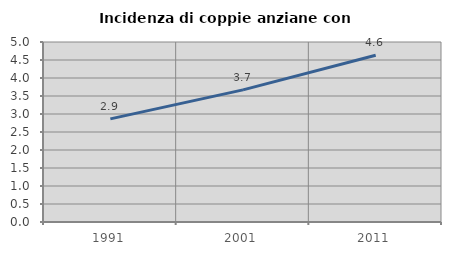
| Category | Incidenza di coppie anziane con figli |
|---|---|
| 1991.0 | 2.864 |
| 2001.0 | 3.67 |
| 2011.0 | 4.631 |